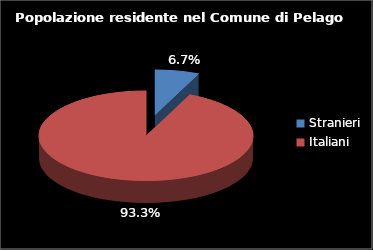
| Category | Series 0 |
|---|---|
| Stranieri | 515 |
| Italiani | 7220 |